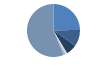
| Category | Series 0 |
|---|---|
| ARRASTRE | 363 |
| CERCO | 150 |
| PALANGRE | 99 |
| REDES DE ENMALLE | 16 |
| ARTES FIJAS | 18 |
| ARTES MENORES | 829 |